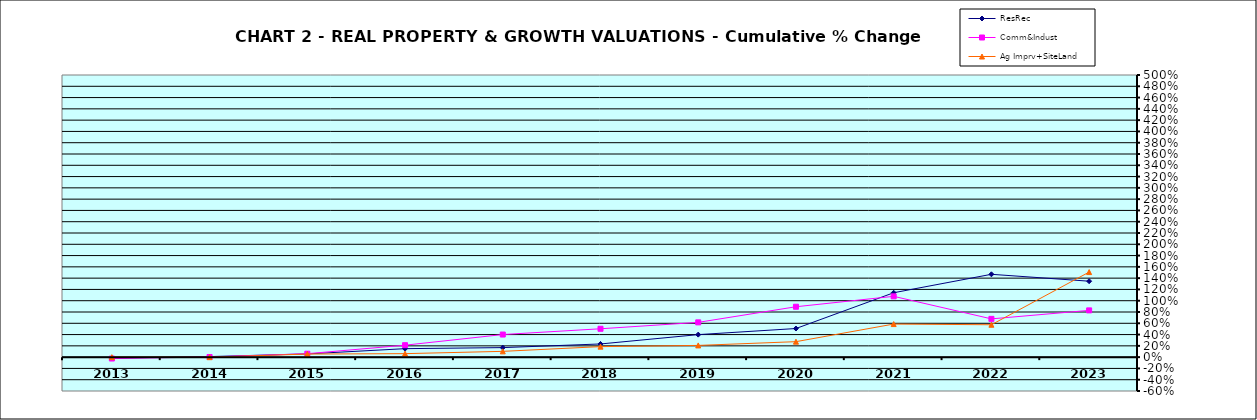
| Category | ResRec | Comm&Indust | Ag Imprv+SiteLand |
|---|---|---|---|
| 2013.0 | -0.017 | -0.025 | 0 |
| 2014.0 | 0.01 | 0.003 | -0.001 |
| 2015.0 | 0.057 | 0.061 | 0.055 |
| 2016.0 | 0.15 | 0.212 | 0.062 |
| 2017.0 | 0.169 | 0.401 | 0.103 |
| 2018.0 | 0.234 | 0.503 | 0.186 |
| 2019.0 | 0.399 | 0.616 | 0.208 |
| 2020.0 | 0.507 | 0.893 | 0.274 |
| 2021.0 | 1.141 | 1.078 | 0.586 |
| 2022.0 | 1.468 | 0.678 | 0.574 |
| 2023.0 | 1.346 | 0.829 | 1.507 |